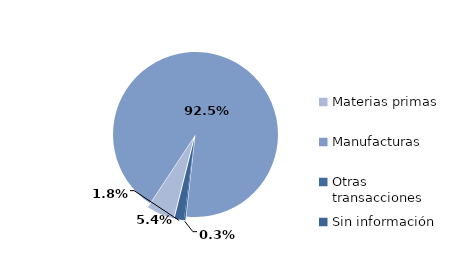
| Category | Series 0 |
|---|---|
| Materias primas | 132.09 |
| Manufacturas | 2262.7 |
| Otras transacciones | 7.41 |
| Sin información | 44.469 |